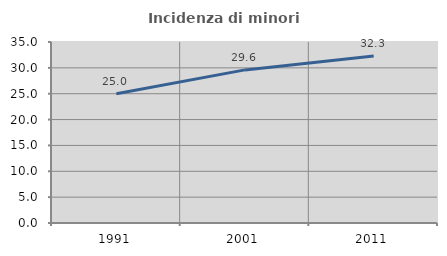
| Category | Incidenza di minori stranieri |
|---|---|
| 1991.0 | 25 |
| 2001.0 | 29.605 |
| 2011.0 | 32.312 |